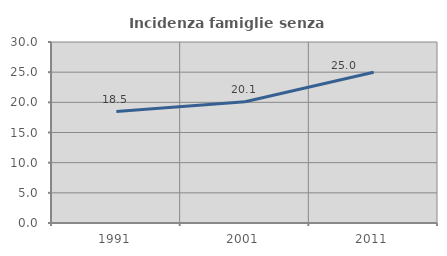
| Category | Incidenza famiglie senza nuclei |
|---|---|
| 1991.0 | 18.473 |
| 2001.0 | 20.101 |
| 2011.0 | 24.987 |